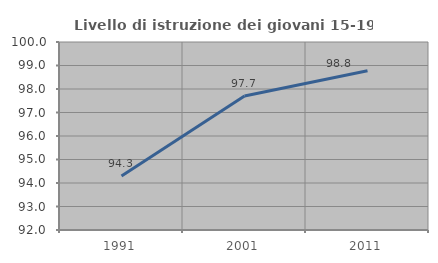
| Category | Livello di istruzione dei giovani 15-19 anni |
|---|---|
| 1991.0 | 94.302 |
| 2001.0 | 97.701 |
| 2011.0 | 98.776 |